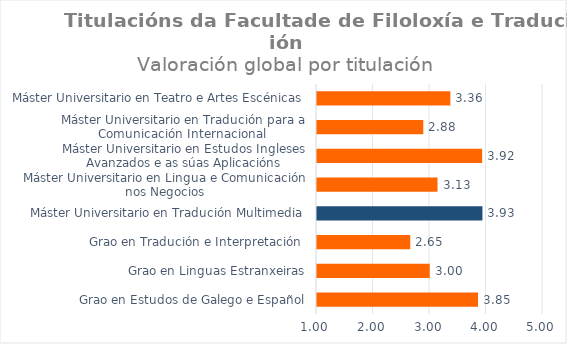
| Category | Series 0 |
|---|---|
| Grao en Estudos de Galego e Español | 3.85 |
| Grao en Linguas Estranxeiras | 2.996 |
| Grao en Tradución e Interpretación  | 2.651 |
| Máster Universitario en Tradución Multimedia | 3.928 |
| Máster Universitario en Lingua e Comunicación nos Negocios | 3.133 |
| Máster Universitario en Estudos Ingleses Avanzados e as súas Aplicacións | 3.923 |
| Máster Universitario en Tradución para a Comunicación Internacional  | 2.881 |
| Máster Universitario en Teatro e Artes Escénicas | 3.36 |